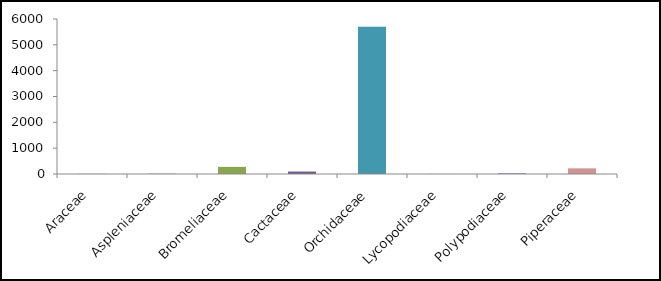
| Category | Quantidade |
|---|---|
| Araceae | 4 |
| Aspleniaceae | 10 |
| Bromeliaceae | 276 |
| Cactaceae | 94 |
| Orchidaceae | 5699 |
| Lycopodiaceae | 3 |
| Polypodiaceae | 40 |
| Piperaceae | 219 |